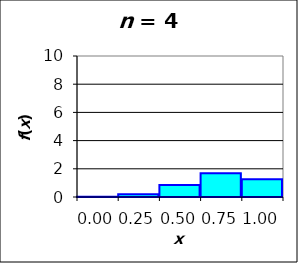
| Category | Series 0 |
|---|---|
| 0.0 | 0.016 |
| 0.25 | 0.188 |
| 0.5 | 0.844 |
| 0.75 | 1.688 |
| 1.0 | 1.266 |